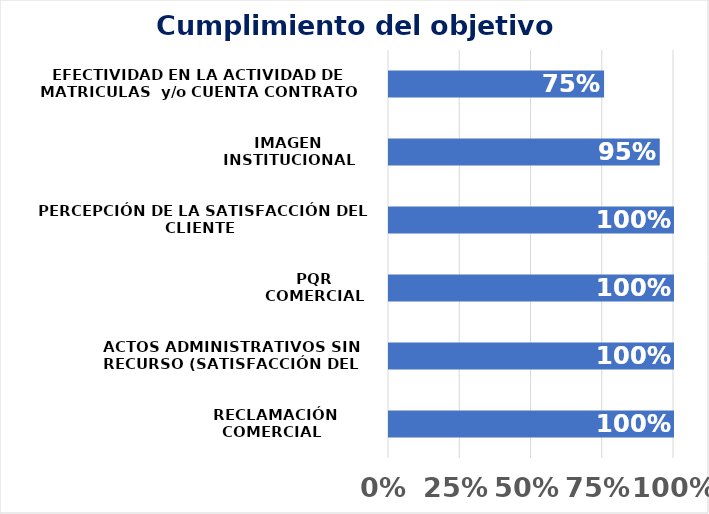
| Category | Series 0 |
|---|---|
| RECLAMACIÓN COMERCIAL  | 1 |
| ACTOS ADMINISTRATIVOS SIN RECURSO (SATISFACCIÓN DEL CLIENTE) | 1 |
| PQR COMERCIAL | 1 |
| PERCEPCIÓN DE LA SATISFACCIÓN DEL CLIENTE | 1 |
| IMAGEN INSTITUCIONAL | 0.95 |
| EFECTIVIDAD EN LA ACTIVIDAD DE MATRICULAS  y/o CUENTA CONTRATO | 0.755 |